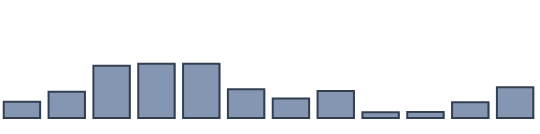
| Category | Series 0 |
|---|---|
| 0 | 4.8 |
| 1 | 7.8 |
| 2 | 15.5 |
| 3 | 16.1 |
| 4 | 16.1 |
| 5 | 8.5 |
| 6 | 5.8 |
| 7 | 8 |
| 8 | 1.7 |
| 9 | 1.8 |
| 10 | 4.7 |
| 11 | 9.1 |